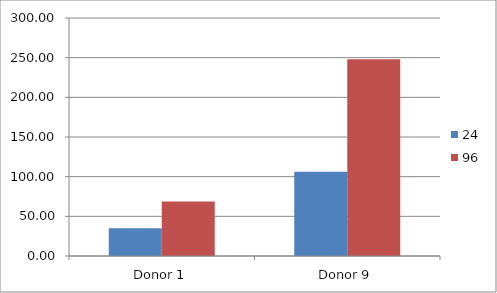
| Category | 24 | 96 |
|---|---|---|
| Donor 1 | 34.987 | 68.708 |
| Donor 9 | 106.275 | 248.024 |